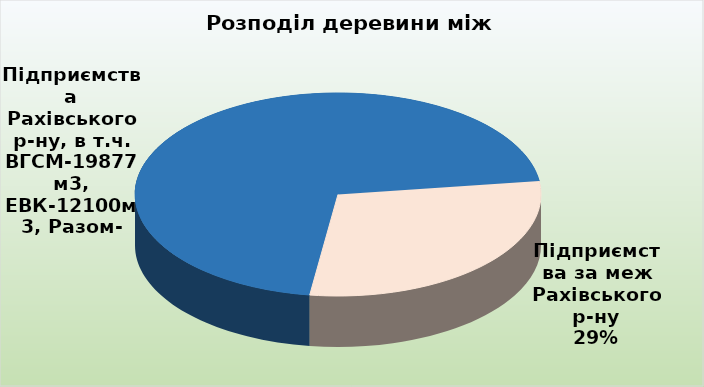
| Category | Series 0 |
|---|---|
| Підприємства Рахівського р-ну, в т.ч. ВГСМ-19877м3, ЕВК-12100м3, Разом- | 66054.287 |
| Підприємства за меж Рахівського р-ну | 27426.009 |